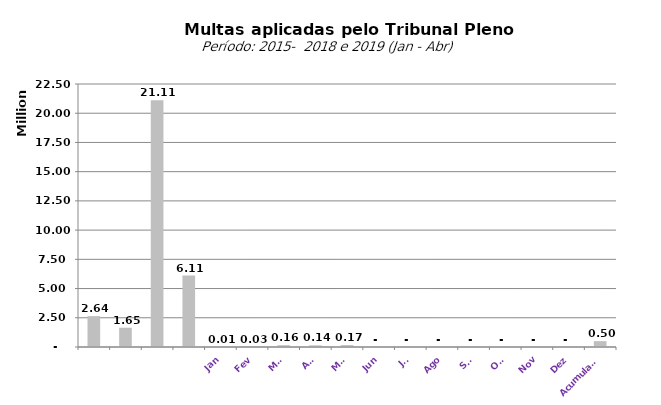
| Category |  1.528.442,62   1.020.189,59   955.160,44   1.276.425,53   2.644.178,81   1.648.289,39   21.112.065,42   6.109.976,68   8.587,38   28.774,76   156.096,39   142.268,21   165.562,13   -     -     -     -     -     -     -    |
|---|---|
|  | 2644178.81 |
|  | 1648289.39 |
|  | 21112065.42 |
|  | 6109976.68 |
| Jan | 8587.38 |
| Fev | 28774.76 |
| Mar | 156096.39 |
| Abr | 142268.21 |
| Mai | 165562.13 |
| Jun | 0 |
| Jul | 0 |
| Ago | 0 |
| Set | 0 |
| Out | 0 |
| Nov | 0 |
| Dez | 0 |
| Acumulado | 501288.87 |